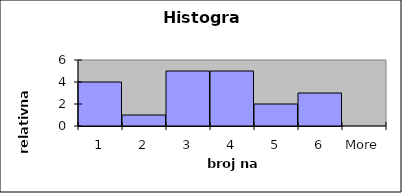
| Category | Frequency |
|---|---|
| 1 | 4 |
| 2 | 1 |
| 3 | 5 |
| 4 | 5 |
| 5 | 2 |
| 6 | 3 |
| More | 0 |